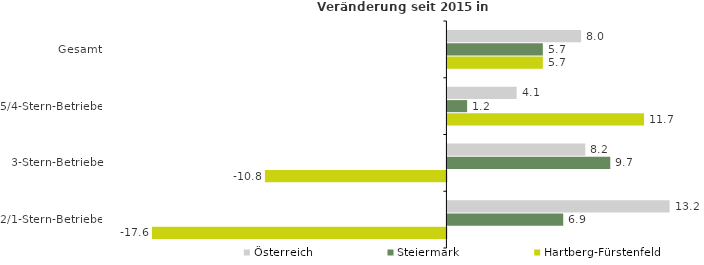
| Category | Österreich | Steiermark | Hartberg-Fürstenfeld |
|---|---|---|---|
| Gesamt | 7.97 | 5.689 | 5.689 |
| 5/4-Stern-Betriebe | 4.13 | 1.174 | 11.725 |
| 3-Stern-Betriebe | 8.22 | 9.709 | -10.822 |
| 2/1-Stern-Betriebe | 13.246 | 6.904 | -17.558 |